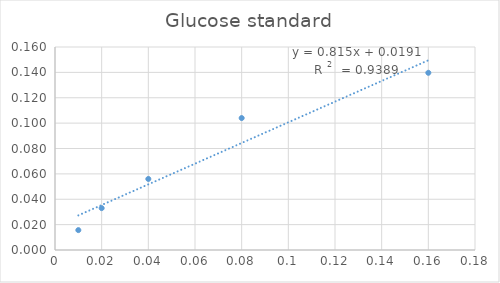
| Category | Series 0 |
|---|---|
| 0.01 | 0.016 |
| 0.02 | 0.033 |
| 0.04 | 0.056 |
| 0.08 | 0.104 |
| 0.16 | 0.14 |